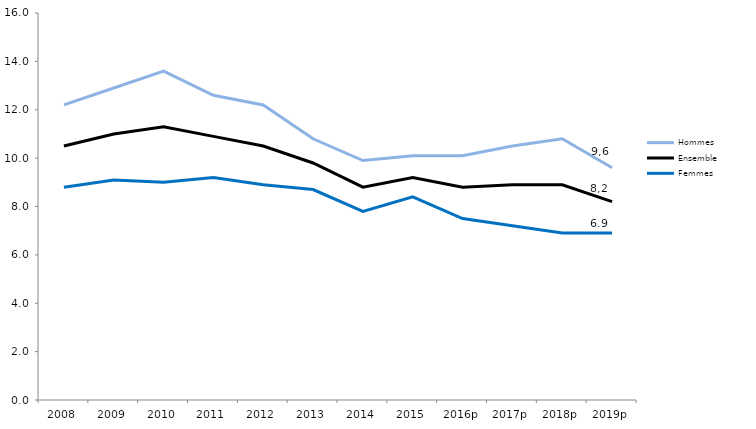
| Category | Hommes | Ensemble | Femmes  |
|---|---|---|---|
| 2008 | 12.2 | 10.5 | 8.8 |
| 2009 | 12.9 | 11 | 9.1 |
| 2010 | 13.6 | 11.3 | 9 |
| 2011 | 12.6 | 10.9 | 9.2 |
| 2012 | 12.2 | 10.5 | 8.9 |
| 2013 | 10.8 | 9.8 | 8.7 |
| 2014 | 9.9 | 8.8 | 7.8 |
| 2015 | 10.1 | 9.2 | 8.4 |
| 2016p | 10.1 | 8.8 | 7.5 |
| 2017p | 10.5 | 8.9 | 7.2 |
| 2018p | 10.8 | 8.9 | 6.9 |
| 2019p | 9.6 | 8.2 | 6.9 |